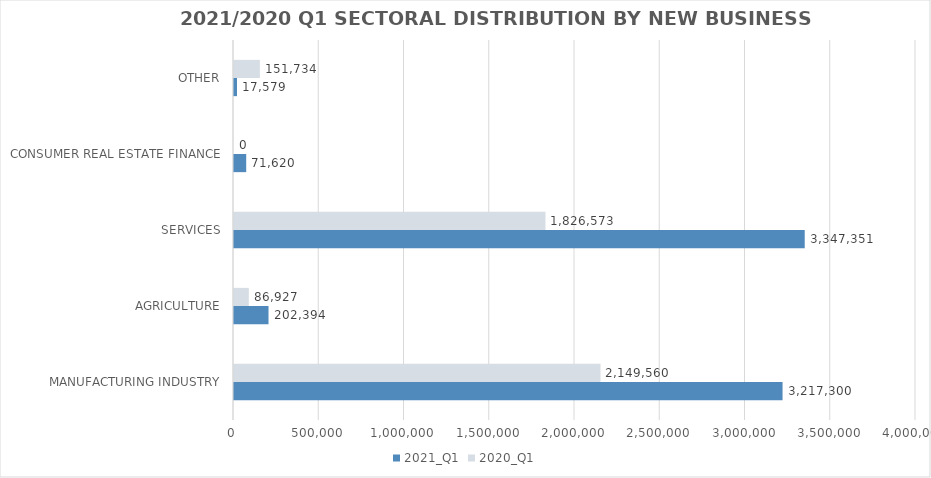
| Category | 2021_Q1 | 2020_Q1 |
|---|---|---|
| MANUFACTURING INDUSTRY | 3217299.68 | 2149559.827 |
| AGRICULTURE | 202393.634 | 86927.157 |
| SERVICES | 3347350.986 | 1826572.746 |
| CONSUMER REAL ESTATE FINANCE | 71620 | 0 |
| OTHER | 17579 | 151734 |